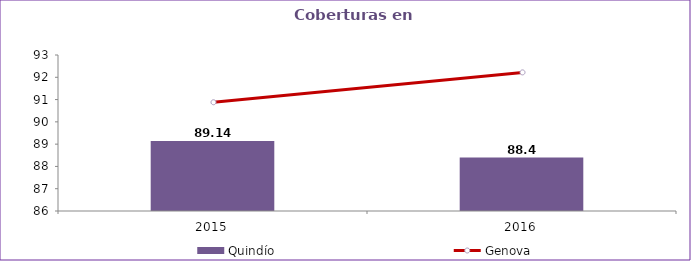
| Category | Quindío |
|---|---|
| 2015.0 | 89.14 |
| 2016.0 | 88.4 |